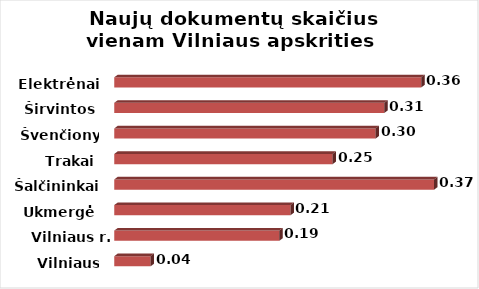
| Category | Series 0 |
|---|---|
| Vilniaus m. | 0.042 |
| Vilniaus r. | 0.192 |
| Ukmergė | 0.205 |
| Šalčininkai | 0.372 |
| Trakai | 0.254 |
| Švenčionys | 0.304 |
| Širvintos | 0.314 |
| Elektrėnai | 0.357 |